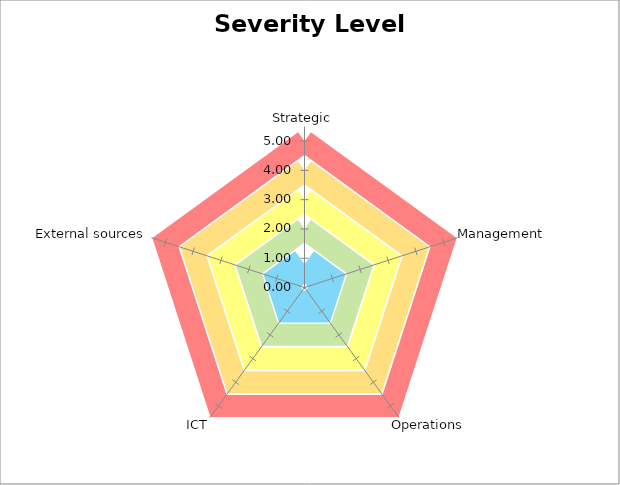
| Category | Average | Max | B | G | Y | O | R |
|---|---|---|---|---|---|---|---|
| Strategic | 0 | 0 | 0.8 | 2 | 3 | 4 | 5 |
| Management | 0 | 0 | 0.8 | 2 | 3 | 4 | 5 |
| Operations | 0 | 0 | 0.8 | 2 | 3 | 4 | 5 |
| ICT | 0 | 0 | 0.8 | 2 | 3 | 4 | 5 |
| External sources | 0 | 0 | 0.8 | 2 | 3 | 4 | 5 |